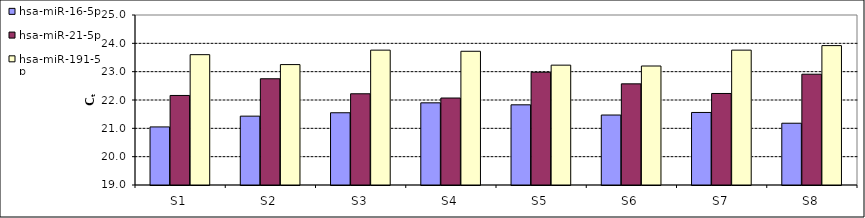
| Category | hsa-miR-16-5p | hsa-miR-21-5p | hsa-miR-191-5p |
|---|---|---|---|
| S1 | 21.05 | 22.16 | 23.6 |
| S2 | 21.43 | 22.75 | 23.25 |
| S3 | 21.55 | 22.22 | 23.76 |
| S4 | 21.9 | 22.07 | 23.72 |
| S5 | 21.83 | 22.98 | 23.23 |
| S6 | 21.47 | 22.57 | 23.2 |
| S7 | 21.56 | 22.23 | 23.76 |
| S8 | 21.18 | 22.91 | 23.92 |